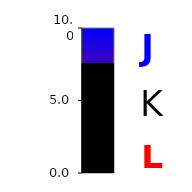
| Category | Series 0 |
|---|---|
| 0 | 7.543 |